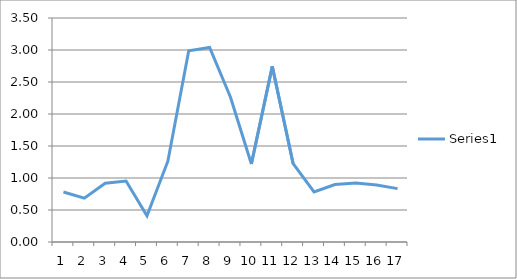
| Category | Series 0 |
|---|---|
| 0 | 0.781 |
| 1 | 0.686 |
| 2 | 0.917 |
| 3 | 0.954 |
| 4 | 0.409 |
| 5 | 1.263 |
| 6 | 2.987 |
| 7 | 3.04 |
| 8 | 2.261 |
| 9 | 1.219 |
| 10 | 2.744 |
| 11 | 1.223 |
| 12 | 0.781 |
| 13 | 0.898 |
| 14 | 0.92 |
| 15 | 0.89 |
| 16 | 0.834 |